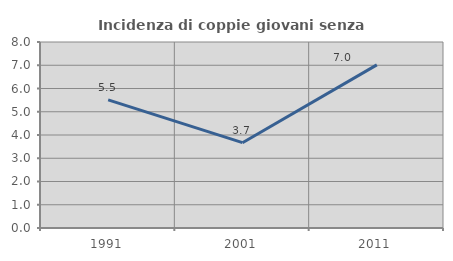
| Category | Incidenza di coppie giovani senza figli |
|---|---|
| 1991.0 | 5.512 |
| 2001.0 | 3.67 |
| 2011.0 | 7.018 |